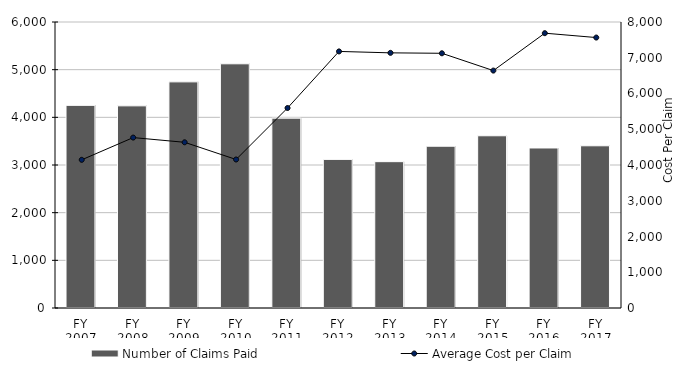
| Category | Number of Claims Paid |
|---|---|
| FY 2007 | 4251 |
| FY 2008 | 4241 |
| FY 2009 | 4744 |
| FY 2010 | 5123 |
| FY 2011 | 3983 |
| FY 2012 | 3118 |
| FY 2013 | 3070 |
| FY 2014 | 3394 |
| FY 2015 | 3613 |
| FY 2016 | 3357 |
| FY 2017 | 3403 |